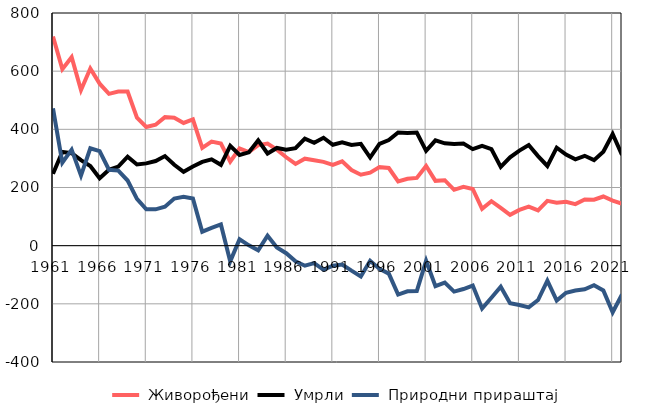
| Category |  Живорођени |  Умрли |  Природни прираштај |
|---|---|---|---|
| 1961.0 | 719 | 247 | 472 |
| 1962.0 | 607 | 322 | 285 |
| 1963.0 | 648 | 318 | 330 |
| 1964.0 | 535 | 294 | 241 |
| 1965.0 | 609 | 274 | 335 |
| 1966.0 | 557 | 232 | 325 |
| 1967.0 | 522 | 261 | 261 |
| 1968.0 | 530 | 272 | 258 |
| 1969.0 | 530 | 306 | 224 |
| 1970.0 | 440 | 279 | 161 |
| 1971.0 | 408 | 283 | 125 |
| 1972.0 | 416 | 291 | 125 |
| 1973.0 | 442 | 308 | 134 |
| 1974.0 | 440 | 278 | 162 |
| 1975.0 | 422 | 254 | 168 |
| 1976.0 | 434 | 272 | 162 |
| 1977.0 | 336 | 288 | 48 |
| 1978.0 | 358 | 297 | 61 |
| 1979.0 | 351 | 278 | 73 |
| 1980.0 | 289 | 343 | -54 |
| 1981.0 | 334 | 312 | 22 |
| 1982.0 | 322 | 321 | 1 |
| 1983.0 | 346 | 362 | -16 |
| 1984.0 | 351 | 317 | 34 |
| 1985.0 | 330 | 336 | -6 |
| 1986.0 | 304 | 330 | -26 |
| 1987.0 | 281 | 335 | -54 |
| 1988.0 | 299 | 368 | -69 |
| 1989.0 | 294 | 354 | -60 |
| 1990.0 | 288 | 371 | -83 |
| 1991.0 | 278 | 347 | -69 |
| 1992.0 | 290 | 355 | -65 |
| 1993.0 | 260 | 346 | -86 |
| 1994.0 | 244 | 350 | -106 |
| 1995.0 | 251 | 303 | -52 |
| 1996.0 | 270 | 350 | -80 |
| 1997.0 | 267 | 363 | -96 |
| 1998.0 | 221 | 389 | -168 |
| 1999.0 | 230 | 387 | -157 |
| 2000.0 | 233 | 389 | -156 |
| 2001.0 | 274 | 326 | -52 |
| 2002.0 | 223 | 362 | -139 |
| 2003.0 | 225 | 352 | -127 |
| 2004.0 | 192 | 350 | -158 |
| 2005.0 | 202 | 351 | -149 |
| 2006.0 | 195 | 332 | -137 |
| 2007.0 | 127 | 343 | -216 |
| 2008.0 | 153 | 332 | -179 |
| 2009.0 | 130 | 271 | -141 |
| 2010.0 | 106 | 304 | -198 |
| 2011.0 | 123 | 327 | -204 |
| 2012.0 | 134 | 346 | -212 |
| 2013.0 | 121 | 308 | -187 |
| 2014.0 | 154 | 274 | -120 |
| 2015.0 | 148 | 337 | -189 |
| 2016.0 | 151 | 313 | -162 |
| 2017.0 | 143 | 297 | -154 |
| 2018.0 | 159 | 309 | -150 |
| 2019.0 | 158 | 294 | -136 |
| 2020.0 | 169 | 323 | -154 |
| 2021.0 | 155 | 384 | -229 |
| 2022.0 | 144 | 312 | -168 |